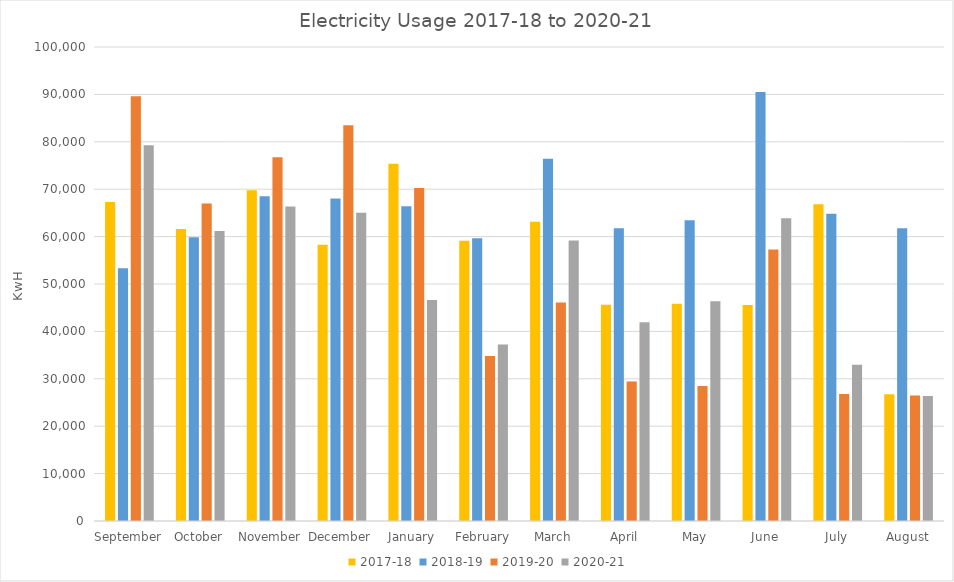
| Category | 2017-18 | 2018-19 | 2019-20 | 2020-21 |
|---|---|---|---|---|
| September  | 67284 | 53331 | 89618 | 79290 |
| October | 61626 | 59869 | 67005 | 61201 |
| November | 69760.9 | 68521 | 76739 | 66344 |
| December | 58285 | 68020 | 83475 | 65058 |
| January | 75390 | 66424 | 70277 | 46641 |
| February | 59105 | 59633 | 34836 | 37226 |
| March | 63145 | 76427 | 46114 | 59165 |
| April | 45645 | 61783 | 29444 | 41907 |
| May | 45840 | 63444 | 28467 | 46351 |
| June | 45573 | 90513 | 57277 | 63897 |
| July | 66802 | 64829 | 26770 | 32955 |
| August | 26765 | 61764 | 26496 | 26358 |